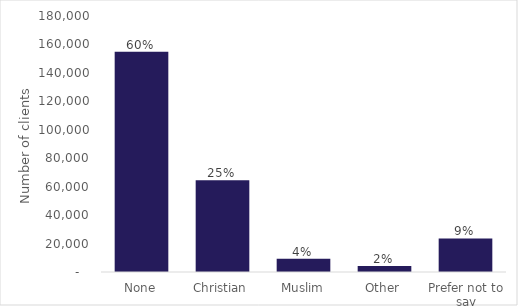
| Category | Series 0 |
|---|---|
| None | 154855 |
| Christian | 64580 |
| Muslim | 9380 |
| Other | 4230 |
| Prefer not to say | 23580 |